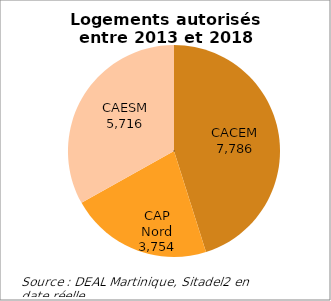
| Category | Series 0 |
|---|---|
| CACEM | 7786 |
| CAP Nord | 3754 |
| CAESM | 5716 |